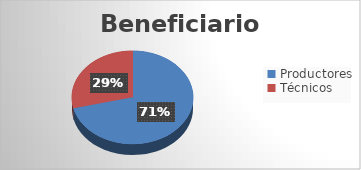
| Category | Series 0 |
|---|---|
| Productores | 57 |
| Técnicos | 23 |